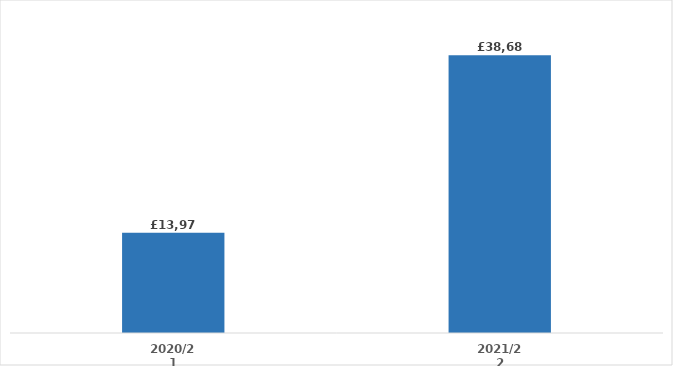
| Category | Series 0 |
|---|---|
| 2020/21 | 13970.04 |
| 2021/22 | 38688 |